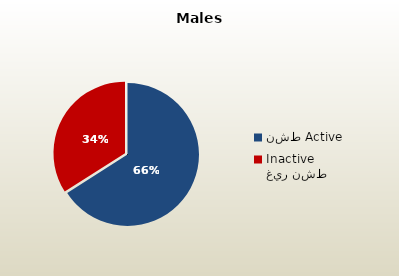
| Category | الذكور القطريين  Qatari Males |
|---|---|
| نشط Active | 72260 |
| غير نشط Inactive | 37298 |